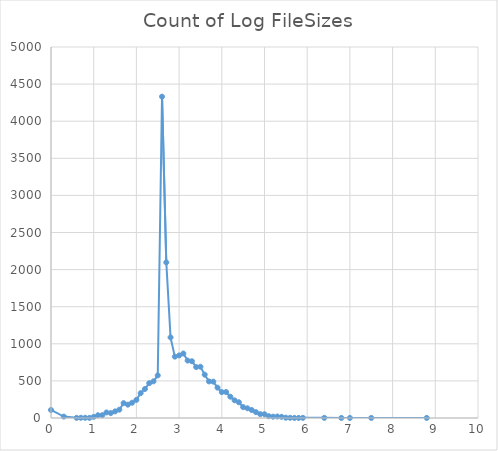
| Category | Count of Log FileSizes |
|---|---|
| 0.0 | 108 |
| 0.3 | 19 |
| 0.6 | 2 |
| 0.7 | 3 |
| 0.8 | 3 |
| 0.9 | 2 |
| 1.0 | 15 |
| 1.1 | 37 |
| 1.2 | 38 |
| 1.3 | 75 |
| 1.4 | 66 |
| 1.5 | 89 |
| 1.6 | 112 |
| 1.7 | 200 |
| 1.8 | 180 |
| 1.9 | 206 |
| 2.0 | 244 |
| 2.1 | 335 |
| 2.2 | 391 |
| 2.3 | 470 |
| 2.4 | 494 |
| 2.5 | 574 |
| 2.6 | 4331 |
| 2.7 | 2097 |
| 2.8 | 1086 |
| 2.9 | 827 |
| 3.0 | 843 |
| 3.1 | 869 |
| 3.2 | 774 |
| 3.3 | 765 |
| 3.4 | 686 |
| 3.5 | 691 |
| 3.6 | 584 |
| 3.7 | 493 |
| 3.8 | 490 |
| 3.9 | 409 |
| 4.0 | 349 |
| 4.1 | 350 |
| 4.2 | 287 |
| 4.3 | 238 |
| 4.4 | 212 |
| 4.5 | 147 |
| 4.6 | 131 |
| 4.7 | 108 |
| 4.8 | 79 |
| 4.9 | 52 |
| 5.0 | 51 |
| 5.1 | 24 |
| 5.2 | 18 |
| 5.3 | 20 |
| 5.4 | 16 |
| 5.5 | 4 |
| 5.6 | 3 |
| 5.7 | 1 |
| 5.8 | 1 |
| 5.9 | 2 |
| 6.4 | 2 |
| 6.8 | 1 |
| 7.0 | 1 |
| 7.5 | 1 |
| 8.8 | 1 |